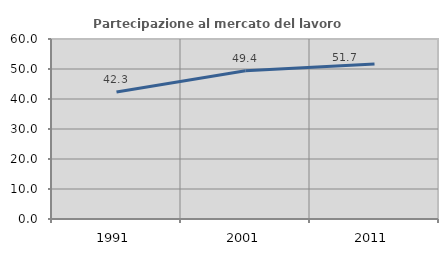
| Category | Partecipazione al mercato del lavoro  femminile |
|---|---|
| 1991.0 | 42.321 |
| 2001.0 | 49.424 |
| 2011.0 | 51.656 |